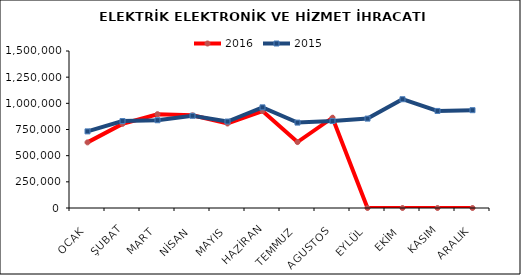
| Category | 2016 | 2015 |
|---|---|---|
| OCAK | 626879.385 | 732034.208 |
| ŞUBAT | 803791.405 | 830881.905 |
| MART | 896196.37 | 838376.199 |
| NİSAN | 885614.679 | 881094.765 |
| MAYIS | 807147.486 | 826084.442 |
| HAZİRAN | 926821.341 | 961652.749 |
| TEMMUZ | 629840.998 | 815920.093 |
| AGUSTOS | 862423.274 | 830815.277 |
| EYLÜL | 0 | 854053.046 |
| EKİM | 0 | 1039303.993 |
| KASIM | 0 | 927258.849 |
| ARALIK | 0 | 934566.609 |